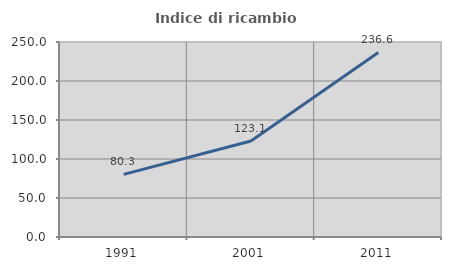
| Category | Indice di ricambio occupazionale  |
|---|---|
| 1991.0 | 80.282 |
| 2001.0 | 123.077 |
| 2011.0 | 236.585 |